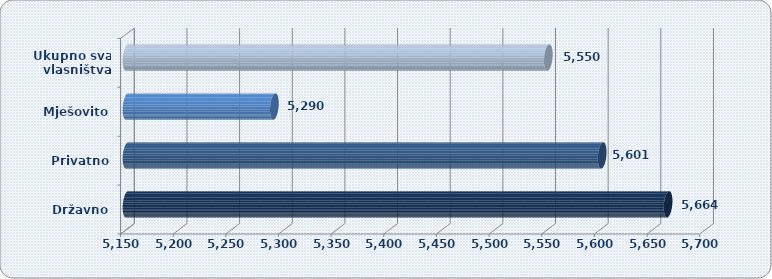
| Category | Prosječna mjesečna neto plaća po zaposlenom |
|---|---|
| Državno | 5663.852 |
| Privatno | 5601.254 |
| Mješovito | 5289.961 |
| Ukupno sva
 vlasništva | 5550.138 |